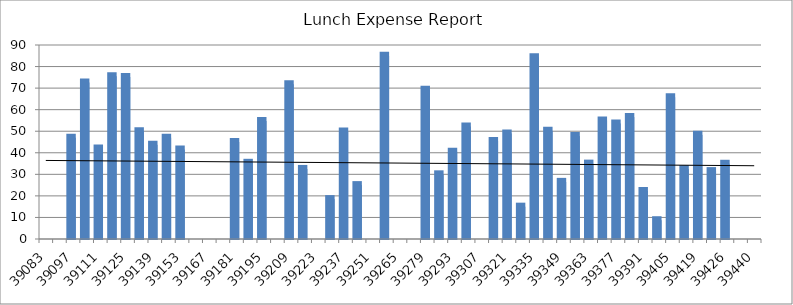
| Category | Lunch Expense Report |
|---|---|
| 39083.0 | 0 |
| 39090.0 | 0 |
| 39097.0 | 47 |
| 39104.0 | 72.56 |
| 39111.0 | 41.95 |
| 39118.0 | 75.53 |
| 39125.0 | 75.12 |
| 39132.0 | 50 |
| 39139.0 | 43.71 |
| 39146.0 | 47 |
| 39153.0 | 41.5 |
| 39160.0 | 0 |
| 39167.0 | 0 |
| 39174.0 | 0 |
| 39181.0 | 45 |
| 39188.0 | 35.35 |
| 39195.0 | 54.75 |
| 39202.0 | 0 |
| 39209.0 | 71.84 |
| 39216.0 | 32.5 |
| 39223.0 | 0 |
| 39230.0 | 18.5 |
| 39237.0 | 49.88 |
| 39244.0 | 25 |
| 39251.0 | 0 |
| 39258.0 | 84.99 |
| 39265.0 | 0 |
| 39272.0 | 0 |
| 39279.0 | 69.25 |
| 39286.0 | 30 |
| 39293.0 | 40.5 |
| 39300.0 | 52.19 |
| 39307.0 | 0 |
| 39314.0 | 45.49 |
| 39321.0 | 49 |
| 39328.0 | 15 |
| 39335.0 | 84.37 |
| 39342.0 | 50.17 |
| 39349.0 | 26.5 |
| 39356.0 | 47.75 |
| 39363.0 | 34.97 |
| 39370.0 | 55.01 |
| 39377.0 | 53.61 |
| 39384.0 | 56.55 |
| 39391.0 | 22.28 |
| 39398.0 | 8.71 |
| 39405.0 | 65.8 |
| 39412.0 | 32.4 |
| 39419.0 | 48.32 |
| 39433.0 | 31.5 |
| 39426.0 | 34.9 |
| 39433.0 | 0 |
| 39440.0 | 0 |